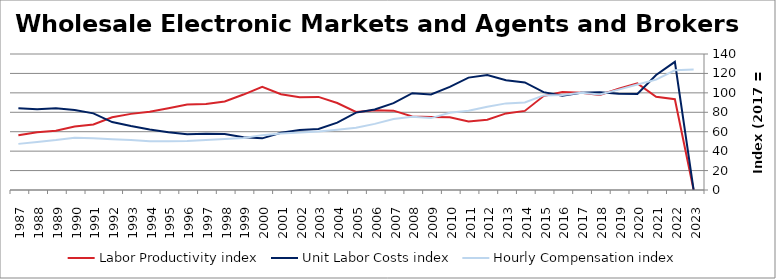
| Category | Labor Productivity index | Unit Labor Costs index | Hourly Compensation index |
|---|---|---|---|
| 2023.0 | 0 | 0 | 123.991 |
| 2022.0 | 93.42 | 131.898 | 123.219 |
| 2021.0 | 95.957 | 118.349 | 113.564 |
| 2020.0 | 109.8 | 98.859 | 108.547 |
| 2019.0 | 104.198 | 99.157 | 103.32 |
| 2018.0 | 97.79 | 100.563 | 98.341 |
| 2017.0 | 100 | 100 | 100 |
| 2016.0 | 100.792 | 97.002 | 97.77 |
| 2015.0 | 96.686 | 100.735 | 97.397 |
| 2014.0 | 81.411 | 110.742 | 90.157 |
| 2013.0 | 78.85 | 113.084 | 89.167 |
| 2012.0 | 72.383 | 118.287 | 85.619 |
| 2011.0 | 70.483 | 115.692 | 81.543 |
| 2010.0 | 74.888 | 106.217 | 79.543 |
| 2009.0 | 75.235 | 98.385 | 74.02 |
| 2008.0 | 75.665 | 99.673 | 75.417 |
| 2007.0 | 81.679 | 89.368 | 72.995 |
| 2006.0 | 82.166 | 82.856 | 68.079 |
| 2005.0 | 80.413 | 79.668 | 64.063 |
| 2004.0 | 89.584 | 69.335 | 62.113 |
| 2003.0 | 95.822 | 62.754 | 60.132 |
| 2002.0 | 95.583 | 61.804 | 59.074 |
| 2001.0 | 98.547 | 58.96 | 58.104 |
| 2000.0 | 106.196 | 53.184 | 56.48 |
| 1999.0 | 98.256 | 54.397 | 53.448 |
| 1998.0 | 91.118 | 57.674 | 52.551 |
| 1997.0 | 88.622 | 57.963 | 51.368 |
| 1996.0 | 87.983 | 57.279 | 50.396 |
| 1995.0 | 84.225 | 59.5 | 50.114 |
| 1994.0 | 80.577 | 62.273 | 50.177 |
| 1993.0 | 78.365 | 65.818 | 51.579 |
| 1992.0 | 74.851 | 69.923 | 52.338 |
| 1991.0 | 67.516 | 78.882 | 53.259 |
| 1990.0 | 65.408 | 82.402 | 53.898 |
| 1989.0 | 61.042 | 84.162 | 51.375 |
| 1988.0 | 59.488 | 83.115 | 49.444 |
| 1987.0 | 56.355 | 84.252 | 47.48 |